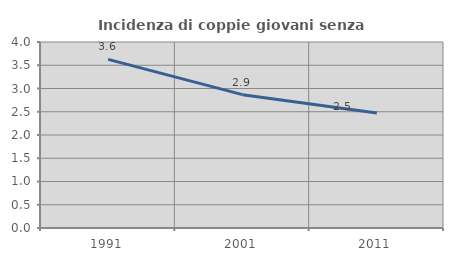
| Category | Incidenza di coppie giovani senza figli |
|---|---|
| 1991.0 | 3.625 |
| 2001.0 | 2.868 |
| 2011.0 | 2.473 |